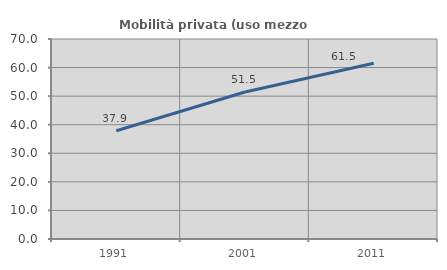
| Category | Mobilità privata (uso mezzo privato) |
|---|---|
| 1991.0 | 37.879 |
| 2001.0 | 51.453 |
| 2011.0 | 61.538 |